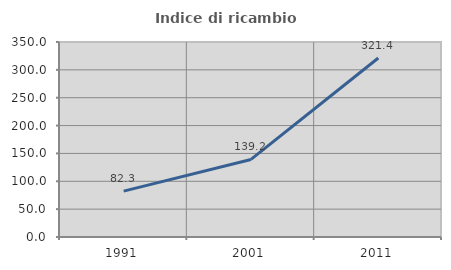
| Category | Indice di ricambio occupazionale  |
|---|---|
| 1991.0 | 82.264 |
| 2001.0 | 139.227 |
| 2011.0 | 321.368 |